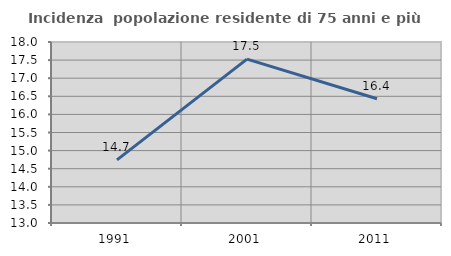
| Category | Incidenza  popolazione residente di 75 anni e più |
|---|---|
| 1991.0 | 14.742 |
| 2001.0 | 17.528 |
| 2011.0 | 16.431 |